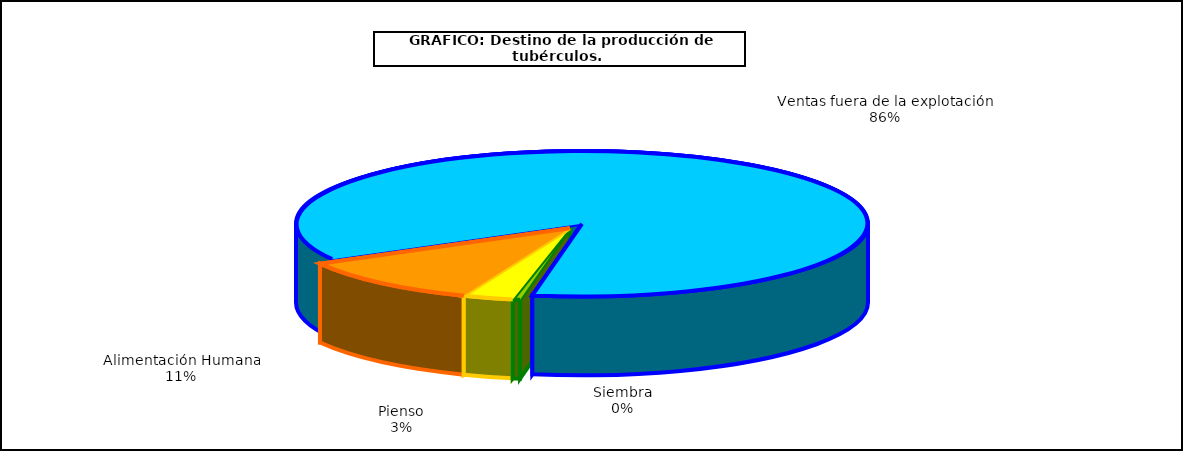
| Category | Series 0 |
|---|---|
| 0 | 9548 |
| 1 | 65610 |
| 2 | 250456 |
| 3 | 1979935 |